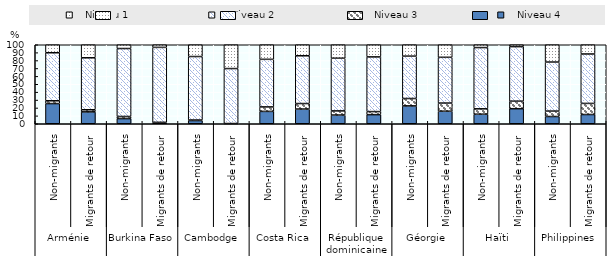
| Category |    Niveau 4 |    Niveau 3 |     Niveau 2 |    Niveau 1 |
|---|---|---|---|---|
| 0 | 25.55 | 3.54 | 60.79 | 10.12 |
| 1 | 15.02 | 2.7 | 65.77 | 16.52 |
| 2 | 6.55 | 2.64 | 86.03 | 4.79 |
| 3 | 1.28 | 0.51 | 94.87 | 3.33 |
| 4 | 4.06 | 0.65 | 80.38 | 14.91 |
| 5 | 0 | 0.29 | 69.57 | 30.14 |
| 6 | 15.66 | 5.66 | 60.21 | 18.47 |
| 7 | 18.6 | 6.98 | 60.47 | 13.95 |
| 8 | 11 | 5.27 | 66.67 | 17.07 |
| 9 | 11.54 | 3.85 | 69.23 | 15.38 |
| 10 | 22.59 | 9.36 | 53.62 | 14.43 |
| 11 | 15.89 | 10.28 | 57.94 | 15.89 |
| 12 | 12.12 | 6.78 | 77.53 | 3.56 |
| 13 | 19.05 | 9.52 | 69.05 | 2.38 |
| 14 | 9.16 | 6.86 | 62.08 | 21.9 |
| 15 | 11.7 | 14.04 | 62.57 | 11.7 |